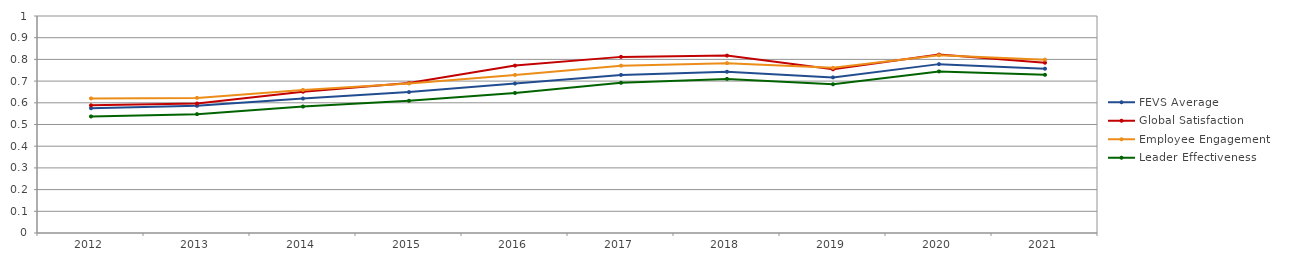
| Category | FEVS Average   | Global Satisfaction   | Employee Engagement   | Leader Effectiveness   |
|---|---|---|---|---|
| 2012 | 0.575 | 0.588 | 0.62 | 0.537 |
| 2013 | 0.586 | 0.597 | 0.623 | 0.548 |
| 2014 | 0.62 | 0.651 | 0.659 | 0.583 |
| 2015 | 0.649 | 0.691 | 0.689 | 0.609 |
| 2016 | 0.689 | 0.771 | 0.728 | 0.645 |
| 2017 | 0.728 | 0.812 | 0.771 | 0.692 |
| 2018 | 0.743 | 0.817 | 0.783 | 0.71 |
| 2019 | 0.717 | 0.754 | 0.761 | 0.685 |
| 2020 | 0.778 | 0.822 | 0.819 | 0.745 |
| 2021 | 0.757 | 0.785 | 0.799 | 0.729 |